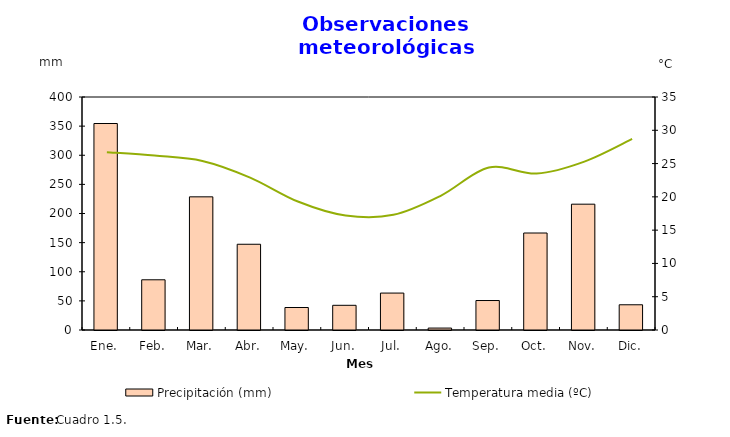
| Category | Precipitación (mm) |
|---|---|
| 0 | 354.5 |
| 1 | 86.2 |
| 2 | 228.6 |
| 3 | 147.2 |
| 4 | 38.6 |
| 5 | 42.4 |
| 6 | 63.4 |
| 7 | 3.3 |
| 8 | 50.6 |
| 9 | 166.5 |
| 10 | 216 |
| 11 | 43.3 |